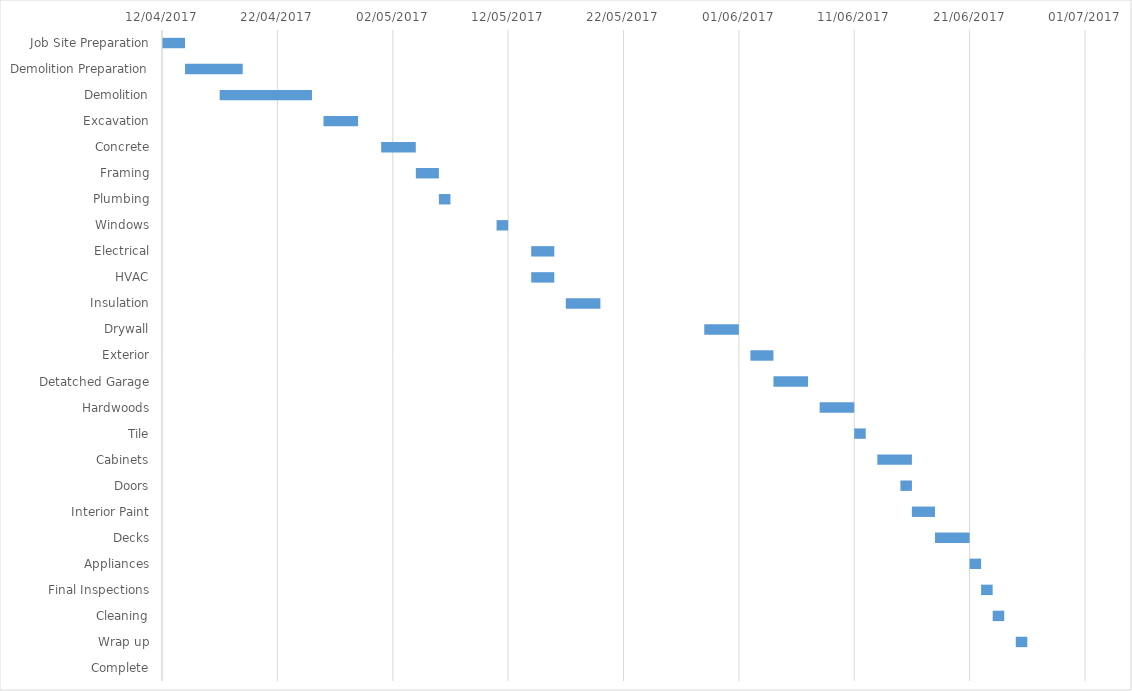
| Category | Start date | Duration |
|---|---|---|
| Job Site Preparation | 2017-04-12 | 2 |
| Demolition Preparation | 2017-04-14 | 5 |
| Demolition | 2017-04-17 | 8 |
| Excavation | 2017-04-26 | 3 |
| Concrete | 2017-05-01 | 3 |
| Framing | 2017-05-04 | 2 |
| Plumbing | 2017-05-06 | 1 |
| Windows | 2017-05-11 | 1 |
| Electrical | 2017-05-14 | 2 |
| HVAC | 2017-05-14 | 2 |
| Insulation | 2017-05-17 | 3 |
| Drywall | 2017-05-29 | 3 |
| Exterior | 2017-06-02 | 2 |
| Detatched Garage | 2017-06-04 | 3 |
| Hardwoods | 2017-06-08 | 3 |
| Tile | 2017-06-11 | 1 |
| Cabinets | 2017-06-13 | 3 |
| Doors | 2017-06-15 | 1 |
| Interior Paint | 2017-06-16 | 2 |
| Decks | 2017-06-18 | 3 |
| Appliances | 2017-06-21 | 1 |
| Final Inspections | 2017-06-22 | 1 |
| Cleaning | 2017-06-23 | 1 |
| Wrap up | 2017-06-25 | 1 |
| Complete | 2017-06-26 | 0 |